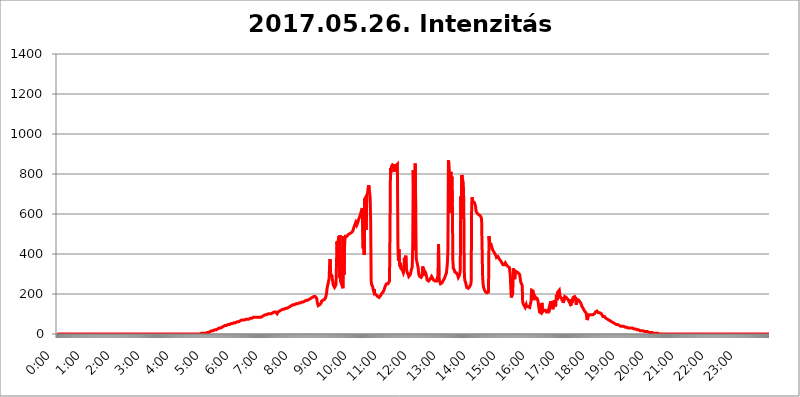
| Category | 2017.05.26. Intenzitás [W/m^2] |
|---|---|
| 0.0 | 0 |
| 0.0006944444444444445 | 0 |
| 0.001388888888888889 | 0 |
| 0.0020833333333333333 | 0 |
| 0.002777777777777778 | 0 |
| 0.003472222222222222 | 0 |
| 0.004166666666666667 | 0 |
| 0.004861111111111111 | 0 |
| 0.005555555555555556 | 0 |
| 0.0062499999999999995 | 0 |
| 0.006944444444444444 | 0 |
| 0.007638888888888889 | 0 |
| 0.008333333333333333 | 0 |
| 0.009027777777777779 | 0 |
| 0.009722222222222222 | 0 |
| 0.010416666666666666 | 0 |
| 0.011111111111111112 | 0 |
| 0.011805555555555555 | 0 |
| 0.012499999999999999 | 0 |
| 0.013194444444444444 | 0 |
| 0.013888888888888888 | 0 |
| 0.014583333333333332 | 0 |
| 0.015277777777777777 | 0 |
| 0.015972222222222224 | 0 |
| 0.016666666666666666 | 0 |
| 0.017361111111111112 | 0 |
| 0.018055555555555557 | 0 |
| 0.01875 | 0 |
| 0.019444444444444445 | 0 |
| 0.02013888888888889 | 0 |
| 0.020833333333333332 | 0 |
| 0.02152777777777778 | 0 |
| 0.022222222222222223 | 0 |
| 0.02291666666666667 | 0 |
| 0.02361111111111111 | 0 |
| 0.024305555555555556 | 0 |
| 0.024999999999999998 | 0 |
| 0.025694444444444447 | 0 |
| 0.02638888888888889 | 0 |
| 0.027083333333333334 | 0 |
| 0.027777777777777776 | 0 |
| 0.02847222222222222 | 0 |
| 0.029166666666666664 | 0 |
| 0.029861111111111113 | 0 |
| 0.030555555555555555 | 0 |
| 0.03125 | 0 |
| 0.03194444444444445 | 0 |
| 0.03263888888888889 | 0 |
| 0.03333333333333333 | 0 |
| 0.034027777777777775 | 0 |
| 0.034722222222222224 | 0 |
| 0.035416666666666666 | 0 |
| 0.036111111111111115 | 0 |
| 0.03680555555555556 | 0 |
| 0.0375 | 0 |
| 0.03819444444444444 | 0 |
| 0.03888888888888889 | 0 |
| 0.03958333333333333 | 0 |
| 0.04027777777777778 | 0 |
| 0.04097222222222222 | 0 |
| 0.041666666666666664 | 0 |
| 0.042361111111111106 | 0 |
| 0.04305555555555556 | 0 |
| 0.043750000000000004 | 0 |
| 0.044444444444444446 | 0 |
| 0.04513888888888889 | 0 |
| 0.04583333333333334 | 0 |
| 0.04652777777777778 | 0 |
| 0.04722222222222222 | 0 |
| 0.04791666666666666 | 0 |
| 0.04861111111111111 | 0 |
| 0.049305555555555554 | 0 |
| 0.049999999999999996 | 0 |
| 0.05069444444444445 | 0 |
| 0.051388888888888894 | 0 |
| 0.052083333333333336 | 0 |
| 0.05277777777777778 | 0 |
| 0.05347222222222222 | 0 |
| 0.05416666666666667 | 0 |
| 0.05486111111111111 | 0 |
| 0.05555555555555555 | 0 |
| 0.05625 | 0 |
| 0.05694444444444444 | 0 |
| 0.057638888888888885 | 0 |
| 0.05833333333333333 | 0 |
| 0.05902777777777778 | 0 |
| 0.059722222222222225 | 0 |
| 0.06041666666666667 | 0 |
| 0.061111111111111116 | 0 |
| 0.06180555555555556 | 0 |
| 0.0625 | 0 |
| 0.06319444444444444 | 0 |
| 0.06388888888888888 | 0 |
| 0.06458333333333334 | 0 |
| 0.06527777777777778 | 0 |
| 0.06597222222222222 | 0 |
| 0.06666666666666667 | 0 |
| 0.06736111111111111 | 0 |
| 0.06805555555555555 | 0 |
| 0.06874999999999999 | 0 |
| 0.06944444444444443 | 0 |
| 0.07013888888888889 | 0 |
| 0.07083333333333333 | 0 |
| 0.07152777777777779 | 0 |
| 0.07222222222222223 | 0 |
| 0.07291666666666667 | 0 |
| 0.07361111111111111 | 0 |
| 0.07430555555555556 | 0 |
| 0.075 | 0 |
| 0.07569444444444444 | 0 |
| 0.0763888888888889 | 0 |
| 0.07708333333333334 | 0 |
| 0.07777777777777778 | 0 |
| 0.07847222222222222 | 0 |
| 0.07916666666666666 | 0 |
| 0.0798611111111111 | 0 |
| 0.08055555555555556 | 0 |
| 0.08125 | 0 |
| 0.08194444444444444 | 0 |
| 0.08263888888888889 | 0 |
| 0.08333333333333333 | 0 |
| 0.08402777777777777 | 0 |
| 0.08472222222222221 | 0 |
| 0.08541666666666665 | 0 |
| 0.08611111111111112 | 0 |
| 0.08680555555555557 | 0 |
| 0.08750000000000001 | 0 |
| 0.08819444444444445 | 0 |
| 0.08888888888888889 | 0 |
| 0.08958333333333333 | 0 |
| 0.09027777777777778 | 0 |
| 0.09097222222222222 | 0 |
| 0.09166666666666667 | 0 |
| 0.09236111111111112 | 0 |
| 0.09305555555555556 | 0 |
| 0.09375 | 0 |
| 0.09444444444444444 | 0 |
| 0.09513888888888888 | 0 |
| 0.09583333333333333 | 0 |
| 0.09652777777777777 | 0 |
| 0.09722222222222222 | 0 |
| 0.09791666666666667 | 0 |
| 0.09861111111111111 | 0 |
| 0.09930555555555555 | 0 |
| 0.09999999999999999 | 0 |
| 0.10069444444444443 | 0 |
| 0.1013888888888889 | 0 |
| 0.10208333333333335 | 0 |
| 0.10277777777777779 | 0 |
| 0.10347222222222223 | 0 |
| 0.10416666666666667 | 0 |
| 0.10486111111111111 | 0 |
| 0.10555555555555556 | 0 |
| 0.10625 | 0 |
| 0.10694444444444444 | 0 |
| 0.1076388888888889 | 0 |
| 0.10833333333333334 | 0 |
| 0.10902777777777778 | 0 |
| 0.10972222222222222 | 0 |
| 0.1111111111111111 | 0 |
| 0.11180555555555556 | 0 |
| 0.11180555555555556 | 0 |
| 0.1125 | 0 |
| 0.11319444444444444 | 0 |
| 0.11388888888888889 | 0 |
| 0.11458333333333333 | 0 |
| 0.11527777777777777 | 0 |
| 0.11597222222222221 | 0 |
| 0.11666666666666665 | 0 |
| 0.1173611111111111 | 0 |
| 0.11805555555555557 | 0 |
| 0.11944444444444445 | 0 |
| 0.12013888888888889 | 0 |
| 0.12083333333333333 | 0 |
| 0.12152777777777778 | 0 |
| 0.12222222222222223 | 0 |
| 0.12291666666666667 | 0 |
| 0.12291666666666667 | 0 |
| 0.12361111111111112 | 0 |
| 0.12430555555555556 | 0 |
| 0.125 | 0 |
| 0.12569444444444444 | 0 |
| 0.12638888888888888 | 0 |
| 0.12708333333333333 | 0 |
| 0.16875 | 0 |
| 0.12847222222222224 | 0 |
| 0.12916666666666668 | 0 |
| 0.12986111111111112 | 0 |
| 0.13055555555555556 | 0 |
| 0.13125 | 0 |
| 0.13194444444444445 | 0 |
| 0.1326388888888889 | 0 |
| 0.13333333333333333 | 0 |
| 0.13402777777777777 | 0 |
| 0.13402777777777777 | 0 |
| 0.13472222222222222 | 0 |
| 0.13541666666666666 | 0 |
| 0.1361111111111111 | 0 |
| 0.13749999999999998 | 0 |
| 0.13819444444444443 | 0 |
| 0.1388888888888889 | 0 |
| 0.13958333333333334 | 0 |
| 0.14027777777777778 | 0 |
| 0.14097222222222222 | 0 |
| 0.14166666666666666 | 0 |
| 0.1423611111111111 | 0 |
| 0.14305555555555557 | 0 |
| 0.14375000000000002 | 0 |
| 0.14444444444444446 | 0 |
| 0.1451388888888889 | 0 |
| 0.1451388888888889 | 0 |
| 0.14652777777777778 | 0 |
| 0.14722222222222223 | 0 |
| 0.14791666666666667 | 0 |
| 0.1486111111111111 | 0 |
| 0.14930555555555555 | 0 |
| 0.15 | 0 |
| 0.15069444444444444 | 0 |
| 0.15138888888888888 | 0 |
| 0.15208333333333332 | 0 |
| 0.15277777777777776 | 0 |
| 0.15347222222222223 | 0 |
| 0.15416666666666667 | 0 |
| 0.15486111111111112 | 0 |
| 0.15555555555555556 | 0 |
| 0.15625 | 0 |
| 0.15694444444444444 | 0 |
| 0.15763888888888888 | 0 |
| 0.15833333333333333 | 0 |
| 0.15902777777777777 | 0 |
| 0.15972222222222224 | 0 |
| 0.16041666666666668 | 0 |
| 0.16111111111111112 | 0 |
| 0.16180555555555556 | 0 |
| 0.1625 | 0 |
| 0.16319444444444445 | 0 |
| 0.1638888888888889 | 0 |
| 0.16458333333333333 | 0 |
| 0.16527777777777777 | 0 |
| 0.16597222222222222 | 0 |
| 0.16666666666666666 | 0 |
| 0.1673611111111111 | 0 |
| 0.16805555555555554 | 0 |
| 0.16874999999999998 | 0 |
| 0.16944444444444443 | 0 |
| 0.17013888888888887 | 0 |
| 0.1708333333333333 | 0 |
| 0.17152777777777775 | 0 |
| 0.17222222222222225 | 0 |
| 0.1729166666666667 | 0 |
| 0.17361111111111113 | 0 |
| 0.17430555555555557 | 0 |
| 0.17500000000000002 | 0 |
| 0.17569444444444446 | 0 |
| 0.1763888888888889 | 0 |
| 0.17708333333333334 | 0 |
| 0.17777777777777778 | 0 |
| 0.17847222222222223 | 0 |
| 0.17916666666666667 | 0 |
| 0.1798611111111111 | 0 |
| 0.18055555555555555 | 0 |
| 0.18125 | 0 |
| 0.18194444444444444 | 0 |
| 0.1826388888888889 | 0 |
| 0.18333333333333335 | 0 |
| 0.1840277777777778 | 0 |
| 0.18472222222222223 | 0 |
| 0.18541666666666667 | 0 |
| 0.18611111111111112 | 0 |
| 0.18680555555555556 | 0 |
| 0.1875 | 0 |
| 0.18819444444444444 | 0 |
| 0.18888888888888888 | 0 |
| 0.18958333333333333 | 0 |
| 0.19027777777777777 | 0 |
| 0.1909722222222222 | 0 |
| 0.19166666666666665 | 0 |
| 0.19236111111111112 | 0 |
| 0.19305555555555554 | 0 |
| 0.19375 | 0 |
| 0.19444444444444445 | 0 |
| 0.1951388888888889 | 0 |
| 0.19583333333333333 | 0 |
| 0.19652777777777777 | 0 |
| 0.19722222222222222 | 0 |
| 0.19791666666666666 | 0 |
| 0.1986111111111111 | 0 |
| 0.19930555555555554 | 0 |
| 0.19999999999999998 | 0 |
| 0.20069444444444443 | 0 |
| 0.20138888888888887 | 3.525 |
| 0.2020833333333333 | 3.525 |
| 0.2027777777777778 | 3.525 |
| 0.2034722222222222 | 3.525 |
| 0.2041666666666667 | 3.525 |
| 0.20486111111111113 | 3.525 |
| 0.20555555555555557 | 3.525 |
| 0.20625000000000002 | 3.525 |
| 0.20694444444444446 | 3.525 |
| 0.2076388888888889 | 3.525 |
| 0.20833333333333334 | 3.525 |
| 0.20902777777777778 | 3.525 |
| 0.20972222222222223 | 3.525 |
| 0.21041666666666667 | 7.887 |
| 0.2111111111111111 | 7.887 |
| 0.21180555555555555 | 7.887 |
| 0.2125 | 7.887 |
| 0.21319444444444444 | 7.887 |
| 0.2138888888888889 | 12.257 |
| 0.21458333333333335 | 12.257 |
| 0.2152777777777778 | 12.257 |
| 0.21597222222222223 | 12.257 |
| 0.21666666666666667 | 16.636 |
| 0.21736111111111112 | 16.636 |
| 0.21805555555555556 | 16.636 |
| 0.21875 | 16.636 |
| 0.21944444444444444 | 16.636 |
| 0.22013888888888888 | 21.024 |
| 0.22083333333333333 | 21.024 |
| 0.22152777777777777 | 21.024 |
| 0.2222222222222222 | 21.024 |
| 0.22291666666666665 | 21.024 |
| 0.2236111111111111 | 25.419 |
| 0.22430555555555556 | 25.419 |
| 0.225 | 25.419 |
| 0.22569444444444445 | 25.419 |
| 0.2263888888888889 | 29.823 |
| 0.22708333333333333 | 29.823 |
| 0.22777777777777777 | 29.823 |
| 0.22847222222222222 | 29.823 |
| 0.22916666666666666 | 29.823 |
| 0.2298611111111111 | 29.823 |
| 0.23055555555555554 | 34.234 |
| 0.23124999999999998 | 34.234 |
| 0.23194444444444443 | 34.234 |
| 0.23263888888888887 | 38.653 |
| 0.2333333333333333 | 38.653 |
| 0.2340277777777778 | 38.653 |
| 0.2347222222222222 | 38.653 |
| 0.2354166666666667 | 43.079 |
| 0.23611111111111113 | 43.079 |
| 0.23680555555555557 | 43.079 |
| 0.23750000000000002 | 43.079 |
| 0.23819444444444446 | 47.511 |
| 0.2388888888888889 | 47.511 |
| 0.23958333333333334 | 47.511 |
| 0.24027777777777778 | 47.511 |
| 0.24097222222222223 | 47.511 |
| 0.24166666666666667 | 47.511 |
| 0.2423611111111111 | 47.511 |
| 0.24305555555555555 | 47.511 |
| 0.24375 | 51.951 |
| 0.24444444444444446 | 51.951 |
| 0.24513888888888888 | 51.951 |
| 0.24583333333333335 | 51.951 |
| 0.2465277777777778 | 51.951 |
| 0.24722222222222223 | 56.398 |
| 0.24791666666666667 | 56.398 |
| 0.24861111111111112 | 56.398 |
| 0.24930555555555556 | 56.398 |
| 0.25 | 56.398 |
| 0.25069444444444444 | 56.398 |
| 0.2513888888888889 | 60.85 |
| 0.2520833333333333 | 60.85 |
| 0.25277777777777777 | 60.85 |
| 0.2534722222222222 | 60.85 |
| 0.25416666666666665 | 60.85 |
| 0.2548611111111111 | 65.31 |
| 0.2555555555555556 | 65.31 |
| 0.25625000000000003 | 65.31 |
| 0.2569444444444445 | 65.31 |
| 0.2576388888888889 | 65.31 |
| 0.25833333333333336 | 69.775 |
| 0.2590277777777778 | 69.775 |
| 0.25972222222222224 | 69.775 |
| 0.2604166666666667 | 69.775 |
| 0.2611111111111111 | 69.775 |
| 0.26180555555555557 | 69.775 |
| 0.2625 | 69.775 |
| 0.26319444444444445 | 74.246 |
| 0.2638888888888889 | 74.246 |
| 0.26458333333333334 | 74.246 |
| 0.2652777777777778 | 74.246 |
| 0.2659722222222222 | 74.246 |
| 0.26666666666666666 | 74.246 |
| 0.2673611111111111 | 74.246 |
| 0.26805555555555555 | 74.246 |
| 0.26875 | 74.246 |
| 0.26944444444444443 | 74.246 |
| 0.2701388888888889 | 78.722 |
| 0.2708333333333333 | 78.722 |
| 0.27152777777777776 | 78.722 |
| 0.2722222222222222 | 78.722 |
| 0.27291666666666664 | 78.722 |
| 0.2736111111111111 | 78.722 |
| 0.2743055555555555 | 78.722 |
| 0.27499999999999997 | 83.205 |
| 0.27569444444444446 | 83.205 |
| 0.27638888888888885 | 83.205 |
| 0.27708333333333335 | 83.205 |
| 0.2777777777777778 | 83.205 |
| 0.27847222222222223 | 83.205 |
| 0.2791666666666667 | 83.205 |
| 0.2798611111111111 | 83.205 |
| 0.28055555555555556 | 83.205 |
| 0.28125 | 83.205 |
| 0.28194444444444444 | 83.205 |
| 0.2826388888888889 | 83.205 |
| 0.2833333333333333 | 83.205 |
| 0.28402777777777777 | 83.205 |
| 0.2847222222222222 | 83.205 |
| 0.28541666666666665 | 83.205 |
| 0.28611111111111115 | 87.692 |
| 0.28680555555555554 | 87.692 |
| 0.28750000000000003 | 87.692 |
| 0.2881944444444445 | 92.184 |
| 0.2888888888888889 | 92.184 |
| 0.28958333333333336 | 92.184 |
| 0.2902777777777778 | 92.184 |
| 0.29097222222222224 | 96.682 |
| 0.2916666666666667 | 96.682 |
| 0.2923611111111111 | 96.682 |
| 0.29305555555555557 | 96.682 |
| 0.29375 | 96.682 |
| 0.29444444444444445 | 96.682 |
| 0.2951388888888889 | 101.184 |
| 0.29583333333333334 | 101.184 |
| 0.2965277777777778 | 101.184 |
| 0.2972222222222222 | 101.184 |
| 0.29791666666666666 | 101.184 |
| 0.2986111111111111 | 101.184 |
| 0.29930555555555555 | 101.184 |
| 0.3 | 101.184 |
| 0.30069444444444443 | 105.69 |
| 0.3013888888888889 | 105.69 |
| 0.3020833333333333 | 105.69 |
| 0.30277777777777776 | 110.201 |
| 0.3034722222222222 | 110.201 |
| 0.30416666666666664 | 110.201 |
| 0.3048611111111111 | 110.201 |
| 0.3055555555555555 | 110.201 |
| 0.30624999999999997 | 110.201 |
| 0.3069444444444444 | 110.201 |
| 0.3076388888888889 | 105.69 |
| 0.30833333333333335 | 101.184 |
| 0.3090277777777778 | 105.69 |
| 0.30972222222222223 | 110.201 |
| 0.3104166666666667 | 105.69 |
| 0.3111111111111111 | 110.201 |
| 0.31180555555555556 | 114.716 |
| 0.3125 | 114.716 |
| 0.31319444444444444 | 119.235 |
| 0.3138888888888889 | 119.235 |
| 0.3145833333333333 | 119.235 |
| 0.31527777777777777 | 119.235 |
| 0.3159722222222222 | 123.758 |
| 0.31666666666666665 | 123.758 |
| 0.31736111111111115 | 123.758 |
| 0.31805555555555554 | 123.758 |
| 0.31875000000000003 | 123.758 |
| 0.3194444444444445 | 128.284 |
| 0.3201388888888889 | 128.284 |
| 0.32083333333333336 | 128.284 |
| 0.3215277777777778 | 128.284 |
| 0.32222222222222224 | 128.284 |
| 0.3229166666666667 | 132.814 |
| 0.3236111111111111 | 132.814 |
| 0.32430555555555557 | 132.814 |
| 0.325 | 137.347 |
| 0.32569444444444445 | 137.347 |
| 0.3263888888888889 | 137.347 |
| 0.32708333333333334 | 137.347 |
| 0.3277777777777778 | 137.347 |
| 0.3284722222222222 | 141.884 |
| 0.32916666666666666 | 141.884 |
| 0.3298611111111111 | 141.884 |
| 0.33055555555555555 | 146.423 |
| 0.33125 | 146.423 |
| 0.33194444444444443 | 146.423 |
| 0.3326388888888889 | 146.423 |
| 0.3333333333333333 | 146.423 |
| 0.3340277777777778 | 146.423 |
| 0.3347222222222222 | 150.964 |
| 0.3354166666666667 | 150.964 |
| 0.3361111111111111 | 150.964 |
| 0.3368055555555556 | 150.964 |
| 0.33749999999999997 | 155.509 |
| 0.33819444444444446 | 155.509 |
| 0.33888888888888885 | 155.509 |
| 0.33958333333333335 | 155.509 |
| 0.34027777777777773 | 155.509 |
| 0.34097222222222223 | 155.509 |
| 0.3416666666666666 | 160.056 |
| 0.3423611111111111 | 160.056 |
| 0.3430555555555555 | 160.056 |
| 0.34375 | 160.056 |
| 0.3444444444444445 | 160.056 |
| 0.3451388888888889 | 160.056 |
| 0.3458333333333334 | 164.605 |
| 0.34652777777777777 | 164.605 |
| 0.34722222222222227 | 164.605 |
| 0.34791666666666665 | 164.605 |
| 0.34861111111111115 | 164.605 |
| 0.34930555555555554 | 169.156 |
| 0.35000000000000003 | 169.156 |
| 0.3506944444444444 | 169.156 |
| 0.3513888888888889 | 169.156 |
| 0.3520833333333333 | 173.709 |
| 0.3527777777777778 | 173.709 |
| 0.3534722222222222 | 173.709 |
| 0.3541666666666667 | 173.709 |
| 0.3548611111111111 | 178.264 |
| 0.35555555555555557 | 178.264 |
| 0.35625 | 178.264 |
| 0.35694444444444445 | 178.264 |
| 0.3576388888888889 | 182.82 |
| 0.35833333333333334 | 182.82 |
| 0.3590277777777778 | 182.82 |
| 0.3597222222222222 | 187.378 |
| 0.36041666666666666 | 187.378 |
| 0.3611111111111111 | 187.378 |
| 0.36180555555555555 | 187.378 |
| 0.3625 | 191.937 |
| 0.36319444444444443 | 187.378 |
| 0.3638888888888889 | 178.264 |
| 0.3645833333333333 | 160.056 |
| 0.3652777777777778 | 150.964 |
| 0.3659722222222222 | 141.884 |
| 0.3666666666666667 | 146.423 |
| 0.3673611111111111 | 146.423 |
| 0.3680555555555556 | 146.423 |
| 0.36874999999999997 | 146.423 |
| 0.36944444444444446 | 150.964 |
| 0.37013888888888885 | 155.509 |
| 0.37083333333333335 | 164.605 |
| 0.37152777777777773 | 164.605 |
| 0.37222222222222223 | 169.156 |
| 0.3729166666666666 | 169.156 |
| 0.3736111111111111 | 169.156 |
| 0.3743055555555555 | 173.709 |
| 0.375 | 173.709 |
| 0.3756944444444445 | 178.264 |
| 0.3763888888888889 | 182.82 |
| 0.3770833333333334 | 191.937 |
| 0.37777777777777777 | 205.62 |
| 0.37847222222222227 | 228.436 |
| 0.37916666666666665 | 242.127 |
| 0.37986111111111115 | 251.251 |
| 0.38055555555555554 | 264.932 |
| 0.38125000000000003 | 274.047 |
| 0.3819444444444444 | 337.639 |
| 0.3826388888888889 | 373.729 |
| 0.3833333333333333 | 310.44 |
| 0.3840277777777778 | 287.709 |
| 0.3847222222222222 | 296.808 |
| 0.3854166666666667 | 283.156 |
| 0.3861111111111111 | 287.709 |
| 0.38680555555555557 | 251.251 |
| 0.3875 | 242.127 |
| 0.38819444444444445 | 237.564 |
| 0.3888888888888889 | 233 |
| 0.38958333333333334 | 233 |
| 0.3902777777777778 | 233 |
| 0.3909722222222222 | 246.689 |
| 0.39166666666666666 | 242.127 |
| 0.3923611111111111 | 462.786 |
| 0.39305555555555555 | 405.108 |
| 0.39375 | 462.786 |
| 0.39444444444444443 | 475.972 |
| 0.3951388888888889 | 489.108 |
| 0.3958333333333333 | 283.156 |
| 0.3965277777777778 | 493.475 |
| 0.3972222222222222 | 264.932 |
| 0.3979166666666667 | 264.932 |
| 0.3986111111111111 | 251.251 |
| 0.3993055555555556 | 255.813 |
| 0.39999999999999997 | 251.251 |
| 0.40069444444444446 | 228.436 |
| 0.40138888888888885 | 489.108 |
| 0.40208333333333335 | 296.808 |
| 0.40277777777777773 | 422.943 |
| 0.40347222222222223 | 471.582 |
| 0.4041666666666666 | 489.108 |
| 0.4048611111111111 | 484.735 |
| 0.4055555555555555 | 489.108 |
| 0.40625 | 489.108 |
| 0.4069444444444445 | 493.475 |
| 0.4076388888888889 | 493.475 |
| 0.4083333333333334 | 497.836 |
| 0.40902777777777777 | 497.836 |
| 0.40972222222222227 | 502.192 |
| 0.41041666666666665 | 502.192 |
| 0.41111111111111115 | 502.192 |
| 0.41180555555555554 | 506.542 |
| 0.41250000000000003 | 506.542 |
| 0.4131944444444444 | 506.542 |
| 0.4138888888888889 | 510.885 |
| 0.4145833333333333 | 515.223 |
| 0.4152777777777778 | 523.88 |
| 0.4159722222222222 | 532.513 |
| 0.4166666666666667 | 536.82 |
| 0.4173611111111111 | 545.416 |
| 0.41805555555555557 | 549.704 |
| 0.41875 | 558.261 |
| 0.41944444444444445 | 562.53 |
| 0.4201388888888889 | 545.416 |
| 0.42083333333333334 | 549.704 |
| 0.4215277777777778 | 558.261 |
| 0.4222222222222222 | 562.53 |
| 0.42291666666666666 | 575.299 |
| 0.4236111111111111 | 579.542 |
| 0.42430555555555555 | 588.009 |
| 0.425 | 592.233 |
| 0.42569444444444443 | 604.864 |
| 0.4263888888888889 | 609.062 |
| 0.4270833333333333 | 621.613 |
| 0.4277777777777778 | 629.948 |
| 0.4284722222222222 | 629.948 |
| 0.4291666666666667 | 427.39 |
| 0.4298611111111111 | 553.986 |
| 0.4305555555555556 | 396.164 |
| 0.43124999999999997 | 675.311 |
| 0.43194444444444446 | 679.395 |
| 0.43263888888888885 | 683.473 |
| 0.43333333333333335 | 519.555 |
| 0.43402777777777773 | 691.608 |
| 0.43472222222222223 | 699.717 |
| 0.4354166666666666 | 707.8 |
| 0.4361111111111111 | 731.896 |
| 0.4368055555555555 | 743.859 |
| 0.4375 | 727.896 |
| 0.4381944444444445 | 723.889 |
| 0.4388888888888889 | 679.395 |
| 0.4395833333333334 | 566.793 |
| 0.44027777777777777 | 264.932 |
| 0.44097222222222227 | 246.689 |
| 0.44166666666666665 | 242.127 |
| 0.44236111111111115 | 237.564 |
| 0.44305555555555554 | 223.873 |
| 0.44375000000000003 | 214.746 |
| 0.4444444444444444 | 223.873 |
| 0.4451388888888889 | 201.058 |
| 0.4458333333333333 | 201.058 |
| 0.4465277777777778 | 201.058 |
| 0.4472222222222222 | 196.497 |
| 0.4479166666666667 | 191.937 |
| 0.4486111111111111 | 191.937 |
| 0.44930555555555557 | 187.378 |
| 0.45 | 182.82 |
| 0.45069444444444445 | 187.378 |
| 0.4513888888888889 | 182.82 |
| 0.45208333333333334 | 182.82 |
| 0.4527777777777778 | 187.378 |
| 0.4534722222222222 | 191.937 |
| 0.45416666666666666 | 196.497 |
| 0.4548611111111111 | 201.058 |
| 0.45555555555555555 | 201.058 |
| 0.45625 | 205.62 |
| 0.45694444444444443 | 210.182 |
| 0.4576388888888889 | 214.746 |
| 0.4583333333333333 | 219.309 |
| 0.4590277777777778 | 228.436 |
| 0.4597222222222222 | 233 |
| 0.4604166666666667 | 242.127 |
| 0.4611111111111111 | 246.689 |
| 0.4618055555555556 | 251.251 |
| 0.46249999999999997 | 255.813 |
| 0.46319444444444446 | 251.251 |
| 0.46388888888888885 | 251.251 |
| 0.46458333333333335 | 246.689 |
| 0.46527777777777773 | 251.251 |
| 0.46597222222222223 | 264.932 |
| 0.4666666666666666 | 506.542 |
| 0.4673611111111111 | 829.981 |
| 0.4680555555555555 | 806.757 |
| 0.46875 | 837.682 |
| 0.4694444444444445 | 837.682 |
| 0.4701388888888889 | 845.365 |
| 0.4708333333333334 | 845.365 |
| 0.47152777777777777 | 841.526 |
| 0.47222222222222227 | 837.682 |
| 0.47291666666666665 | 849.199 |
| 0.47361111111111115 | 810.641 |
| 0.47430555555555554 | 829.981 |
| 0.47500000000000003 | 841.526 |
| 0.4756944444444444 | 845.365 |
| 0.4763888888888889 | 841.526 |
| 0.4770833333333333 | 849.199 |
| 0.4777777777777778 | 445.129 |
| 0.4784722222222222 | 364.728 |
| 0.4791666666666667 | 422.943 |
| 0.4798611111111111 | 364.728 |
| 0.48055555555555557 | 337.639 |
| 0.48125 | 355.712 |
| 0.48194444444444445 | 328.584 |
| 0.4826388888888889 | 324.052 |
| 0.48333333333333334 | 324.052 |
| 0.4840277777777778 | 319.517 |
| 0.4847222222222222 | 314.98 |
| 0.48541666666666666 | 305.898 |
| 0.4861111111111111 | 314.98 |
| 0.48680555555555555 | 378.224 |
| 0.4875 | 346.682 |
| 0.48819444444444443 | 382.715 |
| 0.4888888888888889 | 391.685 |
| 0.4895833333333333 | 328.584 |
| 0.4902777777777778 | 314.98 |
| 0.4909722222222222 | 305.898 |
| 0.4916666666666667 | 301.354 |
| 0.4923611111111111 | 296.808 |
| 0.4930555555555556 | 287.709 |
| 0.49374999999999997 | 287.709 |
| 0.49444444444444446 | 287.709 |
| 0.49513888888888885 | 296.808 |
| 0.49583333333333335 | 301.354 |
| 0.49652777777777773 | 319.517 |
| 0.49722222222222223 | 328.584 |
| 0.4979166666666666 | 337.639 |
| 0.4986111111111111 | 458.38 |
| 0.4993055555555555 | 818.392 |
| 0.5 | 642.4 |
| 0.5006944444444444 | 418.492 |
| 0.5013888888888889 | 609.062 |
| 0.5020833333333333 | 853.029 |
| 0.5027777777777778 | 609.062 |
| 0.5034722222222222 | 378.224 |
| 0.5041666666666667 | 364.728 |
| 0.5048611111111111 | 360.221 |
| 0.5055555555555555 | 342.162 |
| 0.50625 | 328.584 |
| 0.5069444444444444 | 301.354 |
| 0.5076388888888889 | 296.808 |
| 0.5083333333333333 | 287.709 |
| 0.5090277777777777 | 287.709 |
| 0.5097222222222222 | 283.156 |
| 0.5104166666666666 | 283.156 |
| 0.5111111111111112 | 278.603 |
| 0.5118055555555555 | 292.259 |
| 0.5125000000000001 | 337.639 |
| 0.5131944444444444 | 324.052 |
| 0.513888888888889 | 292.259 |
| 0.5145833333333333 | 296.808 |
| 0.5152777777777778 | 314.98 |
| 0.5159722222222222 | 310.44 |
| 0.5166666666666667 | 305.898 |
| 0.517361111111111 | 301.354 |
| 0.5180555555555556 | 287.709 |
| 0.5187499999999999 | 269.49 |
| 0.5194444444444445 | 269.49 |
| 0.5201388888888888 | 264.932 |
| 0.5208333333333334 | 264.932 |
| 0.5215277777777778 | 264.932 |
| 0.5222222222222223 | 269.49 |
| 0.5229166666666667 | 274.047 |
| 0.5236111111111111 | 274.047 |
| 0.5243055555555556 | 278.603 |
| 0.525 | 287.709 |
| 0.5256944444444445 | 283.156 |
| 0.5263888888888889 | 278.603 |
| 0.5270833333333333 | 274.047 |
| 0.5277777777777778 | 269.49 |
| 0.5284722222222222 | 264.932 |
| 0.5291666666666667 | 264.932 |
| 0.5298611111111111 | 264.932 |
| 0.5305555555555556 | 260.373 |
| 0.53125 | 260.373 |
| 0.5319444444444444 | 264.932 |
| 0.5326388888888889 | 264.932 |
| 0.5333333333333333 | 269.49 |
| 0.5340277777777778 | 292.259 |
| 0.5347222222222222 | 449.551 |
| 0.5354166666666667 | 292.259 |
| 0.5361111111111111 | 264.932 |
| 0.5368055555555555 | 260.373 |
| 0.5375 | 251.251 |
| 0.5381944444444444 | 251.251 |
| 0.5388888888888889 | 251.251 |
| 0.5395833333333333 | 255.813 |
| 0.5402777777777777 | 260.373 |
| 0.5409722222222222 | 260.373 |
| 0.5416666666666666 | 269.49 |
| 0.5423611111111112 | 269.49 |
| 0.5430555555555555 | 278.603 |
| 0.5437500000000001 | 283.156 |
| 0.5444444444444444 | 292.259 |
| 0.545138888888889 | 296.808 |
| 0.5458333333333333 | 305.898 |
| 0.5465277777777778 | 328.584 |
| 0.5472222222222222 | 355.712 |
| 0.5479166666666667 | 418.492 |
| 0.548611111111111 | 868.305 |
| 0.5493055555555556 | 849.199 |
| 0.5499999999999999 | 806.757 |
| 0.5506944444444445 | 604.864 |
| 0.5513888888888888 | 791.169 |
| 0.5520833333333334 | 810.641 |
| 0.5527777777777778 | 767.62 |
| 0.5534722222222223 | 787.258 |
| 0.5541666666666667 | 650.667 |
| 0.5548611111111111 | 369.23 |
| 0.5555555555555556 | 328.584 |
| 0.55625 | 324.052 |
| 0.5569444444444445 | 319.517 |
| 0.5576388888888889 | 310.44 |
| 0.5583333333333333 | 305.898 |
| 0.5590277777777778 | 305.898 |
| 0.5597222222222222 | 305.898 |
| 0.5604166666666667 | 305.898 |
| 0.5611111111111111 | 301.354 |
| 0.5618055555555556 | 292.259 |
| 0.5625 | 283.156 |
| 0.5631944444444444 | 287.709 |
| 0.5638888888888889 | 292.259 |
| 0.5645833333333333 | 301.354 |
| 0.5652777777777778 | 324.052 |
| 0.5659722222222222 | 687.544 |
| 0.5666666666666667 | 575.299 |
| 0.5673611111111111 | 795.074 |
| 0.5680555555555555 | 783.342 |
| 0.56875 | 767.62 |
| 0.5694444444444444 | 755.766 |
| 0.5701388888888889 | 667.123 |
| 0.5708333333333333 | 314.98 |
| 0.5715277777777777 | 269.49 |
| 0.5722222222222222 | 264.932 |
| 0.5729166666666666 | 255.813 |
| 0.5736111111111112 | 242.127 |
| 0.5743055555555555 | 233 |
| 0.5750000000000001 | 233 |
| 0.5756944444444444 | 233 |
| 0.576388888888889 | 228.436 |
| 0.5770833333333333 | 228.436 |
| 0.5777777777777778 | 228.436 |
| 0.5784722222222222 | 237.564 |
| 0.5791666666666667 | 242.127 |
| 0.579861111111111 | 246.689 |
| 0.5805555555555556 | 264.932 |
| 0.5812499999999999 | 650.667 |
| 0.5819444444444445 | 683.473 |
| 0.5826388888888888 | 663.019 |
| 0.5833333333333334 | 658.909 |
| 0.5840277777777778 | 658.909 |
| 0.5847222222222223 | 658.909 |
| 0.5854166666666667 | 654.791 |
| 0.5861111111111111 | 646.537 |
| 0.5868055555555556 | 634.105 |
| 0.5875 | 613.252 |
| 0.5881944444444445 | 609.062 |
| 0.5888888888888889 | 604.864 |
| 0.5895833333333333 | 604.864 |
| 0.5902777777777778 | 600.661 |
| 0.5909722222222222 | 596.45 |
| 0.5916666666666667 | 596.45 |
| 0.5923611111111111 | 592.233 |
| 0.5930555555555556 | 592.233 |
| 0.59375 | 588.009 |
| 0.5944444444444444 | 583.779 |
| 0.5951388888888889 | 575.299 |
| 0.5958333333333333 | 571.049 |
| 0.5965277777777778 | 296.808 |
| 0.5972222222222222 | 251.251 |
| 0.5979166666666667 | 233 |
| 0.5986111111111111 | 228.436 |
| 0.5993055555555555 | 219.309 |
| 0.6 | 214.746 |
| 0.6006944444444444 | 210.182 |
| 0.6013888888888889 | 205.62 |
| 0.6020833333333333 | 205.62 |
| 0.6027777777777777 | 205.62 |
| 0.6034722222222222 | 205.62 |
| 0.6041666666666666 | 201.058 |
| 0.6048611111111112 | 210.182 |
| 0.6055555555555555 | 489.108 |
| 0.6062500000000001 | 458.38 |
| 0.6069444444444444 | 458.38 |
| 0.607638888888889 | 458.38 |
| 0.6083333333333333 | 449.551 |
| 0.6090277777777778 | 440.702 |
| 0.6097222222222222 | 431.833 |
| 0.6104166666666667 | 422.943 |
| 0.611111111111111 | 422.943 |
| 0.6118055555555556 | 414.035 |
| 0.6124999999999999 | 414.035 |
| 0.6131944444444445 | 405.108 |
| 0.6138888888888888 | 405.108 |
| 0.6145833333333334 | 400.638 |
| 0.6152777777777778 | 391.685 |
| 0.6159722222222223 | 382.715 |
| 0.6166666666666667 | 382.715 |
| 0.6173611111111111 | 387.202 |
| 0.6180555555555556 | 387.202 |
| 0.61875 | 387.202 |
| 0.6194444444444445 | 382.715 |
| 0.6201388888888889 | 373.729 |
| 0.6208333333333333 | 369.23 |
| 0.6215277777777778 | 369.23 |
| 0.6222222222222222 | 364.728 |
| 0.6229166666666667 | 360.221 |
| 0.6236111111111111 | 355.712 |
| 0.6243055555555556 | 351.198 |
| 0.625 | 346.682 |
| 0.6256944444444444 | 342.162 |
| 0.6263888888888889 | 346.682 |
| 0.6270833333333333 | 346.682 |
| 0.6277777777777778 | 346.682 |
| 0.6284722222222222 | 355.712 |
| 0.6291666666666667 | 351.198 |
| 0.6298611111111111 | 346.682 |
| 0.6305555555555555 | 346.682 |
| 0.63125 | 342.162 |
| 0.6319444444444444 | 337.639 |
| 0.6326388888888889 | 333.113 |
| 0.6333333333333333 | 333.113 |
| 0.6340277777777777 | 333.113 |
| 0.6347222222222222 | 333.113 |
| 0.6354166666666666 | 292.259 |
| 0.6361111111111112 | 233 |
| 0.6368055555555555 | 182.82 |
| 0.6375000000000001 | 182.82 |
| 0.6381944444444444 | 187.378 |
| 0.638888888888889 | 205.62 |
| 0.6395833333333333 | 328.584 |
| 0.6402777777777778 | 319.517 |
| 0.6409722222222222 | 324.052 |
| 0.6416666666666667 | 274.047 |
| 0.642361111111111 | 314.98 |
| 0.6430555555555556 | 314.98 |
| 0.6437499999999999 | 314.98 |
| 0.6444444444444445 | 310.44 |
| 0.6451388888888888 | 314.98 |
| 0.6458333333333334 | 314.98 |
| 0.6465277777777778 | 305.898 |
| 0.6472222222222223 | 305.898 |
| 0.6479166666666667 | 301.354 |
| 0.6486111111111111 | 296.808 |
| 0.6493055555555556 | 292.259 |
| 0.65 | 260.373 |
| 0.6506944444444445 | 264.932 |
| 0.6513888888888889 | 264.932 |
| 0.6520833333333333 | 242.127 |
| 0.6527777777777778 | 160.056 |
| 0.6534722222222222 | 150.964 |
| 0.6541666666666667 | 146.423 |
| 0.6548611111111111 | 141.884 |
| 0.6555555555555556 | 137.347 |
| 0.65625 | 132.814 |
| 0.6569444444444444 | 132.814 |
| 0.6576388888888889 | 146.423 |
| 0.6583333333333333 | 137.347 |
| 0.6590277777777778 | 137.347 |
| 0.6597222222222222 | 132.814 |
| 0.6604166666666667 | 137.347 |
| 0.6611111111111111 | 132.814 |
| 0.6618055555555555 | 132.814 |
| 0.6625 | 132.814 |
| 0.6631944444444444 | 132.814 |
| 0.6638888888888889 | 137.347 |
| 0.6645833333333333 | 164.605 |
| 0.6652777777777777 | 219.309 |
| 0.6659722222222222 | 219.309 |
| 0.6666666666666666 | 219.309 |
| 0.6673611111111111 | 214.746 |
| 0.6680555555555556 | 201.058 |
| 0.6687500000000001 | 169.156 |
| 0.6694444444444444 | 191.937 |
| 0.6701388888888888 | 191.937 |
| 0.6708333333333334 | 182.82 |
| 0.6715277777777778 | 182.82 |
| 0.6722222222222222 | 182.82 |
| 0.6729166666666666 | 178.264 |
| 0.6736111111111112 | 173.709 |
| 0.6743055555555556 | 164.605 |
| 0.6749999999999999 | 164.605 |
| 0.6756944444444444 | 128.284 |
| 0.6763888888888889 | 110.201 |
| 0.6770833333333334 | 110.201 |
| 0.6777777777777777 | 105.69 |
| 0.6784722222222223 | 105.69 |
| 0.6791666666666667 | 105.69 |
| 0.6798611111111111 | 155.509 |
| 0.6805555555555555 | 110.201 |
| 0.68125 | 110.201 |
| 0.6819444444444445 | 114.716 |
| 0.6826388888888889 | 119.235 |
| 0.6833333333333332 | 119.235 |
| 0.6840277777777778 | 119.235 |
| 0.6847222222222222 | 119.235 |
| 0.6854166666666667 | 119.235 |
| 0.686111111111111 | 110.201 |
| 0.6868055555555556 | 110.201 |
| 0.6875 | 110.201 |
| 0.6881944444444444 | 110.201 |
| 0.688888888888889 | 110.201 |
| 0.6895833333333333 | 110.201 |
| 0.6902777777777778 | 137.347 |
| 0.6909722222222222 | 128.284 |
| 0.6916666666666668 | 137.347 |
| 0.6923611111111111 | 164.605 |
| 0.6930555555555555 | 169.156 |
| 0.69375 | 141.884 |
| 0.6944444444444445 | 146.423 |
| 0.6951388888888889 | 123.758 |
| 0.6958333333333333 | 119.235 |
| 0.6965277777777777 | 123.758 |
| 0.6972222222222223 | 169.156 |
| 0.6979166666666666 | 150.964 |
| 0.6986111111111111 | 137.347 |
| 0.6993055555555556 | 150.964 |
| 0.7000000000000001 | 196.497 |
| 0.7006944444444444 | 182.82 |
| 0.7013888888888888 | 169.156 |
| 0.7020833333333334 | 210.182 |
| 0.7027777777777778 | 214.746 |
| 0.7034722222222222 | 214.746 |
| 0.7041666666666666 | 219.309 |
| 0.7048611111111112 | 214.746 |
| 0.7055555555555556 | 182.82 |
| 0.7062499999999999 | 187.378 |
| 0.7069444444444444 | 182.82 |
| 0.7076388888888889 | 178.264 |
| 0.7083333333333334 | 164.605 |
| 0.7090277777777777 | 182.82 |
| 0.7097222222222223 | 155.509 |
| 0.7104166666666667 | 155.509 |
| 0.7111111111111111 | 150.964 |
| 0.7118055555555555 | 187.378 |
| 0.7125 | 182.82 |
| 0.7131944444444445 | 182.82 |
| 0.7138888888888889 | 182.82 |
| 0.7145833333333332 | 178.264 |
| 0.7152777777777778 | 178.264 |
| 0.7159722222222222 | 173.709 |
| 0.7166666666666667 | 169.156 |
| 0.717361111111111 | 164.605 |
| 0.7180555555555556 | 164.605 |
| 0.71875 | 155.509 |
| 0.7194444444444444 | 173.709 |
| 0.720138888888889 | 141.884 |
| 0.7208333333333333 | 146.423 |
| 0.7215277777777778 | 164.605 |
| 0.7222222222222222 | 155.509 |
| 0.7229166666666668 | 150.964 |
| 0.7236111111111111 | 182.82 |
| 0.7243055555555555 | 187.378 |
| 0.725 | 187.378 |
| 0.7256944444444445 | 187.378 |
| 0.7263888888888889 | 187.378 |
| 0.7270833333333333 | 178.264 |
| 0.7277777777777777 | 146.423 |
| 0.7284722222222223 | 155.509 |
| 0.7291666666666666 | 173.709 |
| 0.7298611111111111 | 173.709 |
| 0.7305555555555556 | 169.156 |
| 0.7312500000000001 | 169.156 |
| 0.7319444444444444 | 164.605 |
| 0.7326388888888888 | 164.605 |
| 0.7333333333333334 | 160.056 |
| 0.7340277777777778 | 155.509 |
| 0.7347222222222222 | 150.964 |
| 0.7354166666666666 | 141.884 |
| 0.7361111111111112 | 137.347 |
| 0.7368055555555556 | 132.814 |
| 0.7374999999999999 | 128.284 |
| 0.7381944444444444 | 123.758 |
| 0.7388888888888889 | 119.235 |
| 0.7395833333333334 | 114.716 |
| 0.7402777777777777 | 110.201 |
| 0.7409722222222223 | 110.201 |
| 0.7416666666666667 | 105.69 |
| 0.7423611111111111 | 92.184 |
| 0.7430555555555555 | 69.775 |
| 0.74375 | 74.246 |
| 0.7444444444444445 | 83.205 |
| 0.7451388888888889 | 96.682 |
| 0.7458333333333332 | 96.682 |
| 0.7465277777777778 | 96.682 |
| 0.7472222222222222 | 96.682 |
| 0.7479166666666667 | 96.682 |
| 0.748611111111111 | 96.682 |
| 0.7493055555555556 | 96.682 |
| 0.75 | 96.682 |
| 0.7506944444444444 | 96.682 |
| 0.751388888888889 | 96.682 |
| 0.7520833333333333 | 96.682 |
| 0.7527777777777778 | 101.184 |
| 0.7534722222222222 | 101.184 |
| 0.7541666666666668 | 105.69 |
| 0.7548611111111111 | 110.201 |
| 0.7555555555555555 | 114.716 |
| 0.75625 | 114.716 |
| 0.7569444444444445 | 114.716 |
| 0.7576388888888889 | 110.201 |
| 0.7583333333333333 | 110.201 |
| 0.7590277777777777 | 105.69 |
| 0.7597222222222223 | 105.69 |
| 0.7604166666666666 | 105.69 |
| 0.7611111111111111 | 105.69 |
| 0.7618055555555556 | 101.184 |
| 0.7625000000000001 | 101.184 |
| 0.7631944444444444 | 101.184 |
| 0.7638888888888888 | 96.682 |
| 0.7645833333333334 | 96.682 |
| 0.7652777777777778 | 87.692 |
| 0.7659722222222222 | 87.692 |
| 0.7666666666666666 | 87.692 |
| 0.7673611111111112 | 87.692 |
| 0.7680555555555556 | 83.205 |
| 0.7687499999999999 | 83.205 |
| 0.7694444444444444 | 78.722 |
| 0.7701388888888889 | 74.246 |
| 0.7708333333333334 | 74.246 |
| 0.7715277777777777 | 74.246 |
| 0.7722222222222223 | 69.775 |
| 0.7729166666666667 | 69.775 |
| 0.7736111111111111 | 69.775 |
| 0.7743055555555555 | 65.31 |
| 0.775 | 65.31 |
| 0.7756944444444445 | 65.31 |
| 0.7763888888888889 | 60.85 |
| 0.7770833333333332 | 60.85 |
| 0.7777777777777778 | 60.85 |
| 0.7784722222222222 | 56.398 |
| 0.7791666666666667 | 56.398 |
| 0.779861111111111 | 56.398 |
| 0.7805555555555556 | 56.398 |
| 0.78125 | 51.951 |
| 0.7819444444444444 | 51.951 |
| 0.782638888888889 | 51.951 |
| 0.7833333333333333 | 51.951 |
| 0.7840277777777778 | 47.511 |
| 0.7847222222222222 | 47.511 |
| 0.7854166666666668 | 47.511 |
| 0.7861111111111111 | 47.511 |
| 0.7868055555555555 | 43.079 |
| 0.7875 | 43.079 |
| 0.7881944444444445 | 43.079 |
| 0.7888888888888889 | 43.079 |
| 0.7895833333333333 | 43.079 |
| 0.7902777777777777 | 38.653 |
| 0.7909722222222223 | 38.653 |
| 0.7916666666666666 | 38.653 |
| 0.7923611111111111 | 38.653 |
| 0.7930555555555556 | 38.653 |
| 0.7937500000000001 | 38.653 |
| 0.7944444444444444 | 38.653 |
| 0.7951388888888888 | 38.653 |
| 0.7958333333333334 | 34.234 |
| 0.7965277777777778 | 34.234 |
| 0.7972222222222222 | 34.234 |
| 0.7979166666666666 | 34.234 |
| 0.7986111111111112 | 34.234 |
| 0.7993055555555556 | 34.234 |
| 0.7999999999999999 | 34.234 |
| 0.8006944444444444 | 29.823 |
| 0.8013888888888889 | 29.823 |
| 0.8020833333333334 | 29.823 |
| 0.8027777777777777 | 29.823 |
| 0.8034722222222223 | 29.823 |
| 0.8041666666666667 | 29.823 |
| 0.8048611111111111 | 29.823 |
| 0.8055555555555555 | 29.823 |
| 0.80625 | 29.823 |
| 0.8069444444444445 | 29.823 |
| 0.8076388888888889 | 25.419 |
| 0.8083333333333332 | 25.419 |
| 0.8090277777777778 | 25.419 |
| 0.8097222222222222 | 25.419 |
| 0.8104166666666667 | 25.419 |
| 0.811111111111111 | 25.419 |
| 0.8118055555555556 | 25.419 |
| 0.8125 | 25.419 |
| 0.8131944444444444 | 21.024 |
| 0.813888888888889 | 21.024 |
| 0.8145833333333333 | 21.024 |
| 0.8152777777777778 | 21.024 |
| 0.8159722222222222 | 21.024 |
| 0.8166666666666668 | 21.024 |
| 0.8173611111111111 | 16.636 |
| 0.8180555555555555 | 16.636 |
| 0.81875 | 16.636 |
| 0.8194444444444445 | 16.636 |
| 0.8201388888888889 | 16.636 |
| 0.8208333333333333 | 16.636 |
| 0.8215277777777777 | 16.636 |
| 0.8222222222222223 | 16.636 |
| 0.8229166666666666 | 12.257 |
| 0.8236111111111111 | 12.257 |
| 0.8243055555555556 | 12.257 |
| 0.8250000000000001 | 12.257 |
| 0.8256944444444444 | 12.257 |
| 0.8263888888888888 | 12.257 |
| 0.8270833333333334 | 12.257 |
| 0.8277777777777778 | 12.257 |
| 0.8284722222222222 | 12.257 |
| 0.8291666666666666 | 12.257 |
| 0.8298611111111112 | 7.887 |
| 0.8305555555555556 | 7.887 |
| 0.8312499999999999 | 7.887 |
| 0.8319444444444444 | 7.887 |
| 0.8326388888888889 | 7.887 |
| 0.8333333333333334 | 7.887 |
| 0.8340277777777777 | 7.887 |
| 0.8347222222222223 | 7.887 |
| 0.8354166666666667 | 7.887 |
| 0.8361111111111111 | 3.525 |
| 0.8368055555555555 | 3.525 |
| 0.8375 | 3.525 |
| 0.8381944444444445 | 3.525 |
| 0.8388888888888889 | 3.525 |
| 0.8395833333333332 | 3.525 |
| 0.8402777777777778 | 3.525 |
| 0.8409722222222222 | 3.525 |
| 0.8416666666666667 | 3.525 |
| 0.842361111111111 | 3.525 |
| 0.8430555555555556 | 3.525 |
| 0.84375 | 0 |
| 0.8444444444444444 | 0 |
| 0.845138888888889 | 0 |
| 0.8458333333333333 | 0 |
| 0.8465277777777778 | 0 |
| 0.8472222222222222 | 0 |
| 0.8479166666666668 | 0 |
| 0.8486111111111111 | 0 |
| 0.8493055555555555 | 0 |
| 0.85 | 0 |
| 0.8506944444444445 | 0 |
| 0.8513888888888889 | 0 |
| 0.8520833333333333 | 0 |
| 0.8527777777777777 | 0 |
| 0.8534722222222223 | 0 |
| 0.8541666666666666 | 0 |
| 0.8548611111111111 | 0 |
| 0.8555555555555556 | 0 |
| 0.8562500000000001 | 0 |
| 0.8569444444444444 | 0 |
| 0.8576388888888888 | 0 |
| 0.8583333333333334 | 0 |
| 0.8590277777777778 | 0 |
| 0.8597222222222222 | 0 |
| 0.8604166666666666 | 0 |
| 0.8611111111111112 | 0 |
| 0.8618055555555556 | 0 |
| 0.8624999999999999 | 0 |
| 0.8631944444444444 | 0 |
| 0.8638888888888889 | 0 |
| 0.8645833333333334 | 0 |
| 0.8652777777777777 | 0 |
| 0.8659722222222223 | 0 |
| 0.8666666666666667 | 0 |
| 0.8673611111111111 | 0 |
| 0.8680555555555555 | 0 |
| 0.86875 | 0 |
| 0.8694444444444445 | 0 |
| 0.8701388888888889 | 0 |
| 0.8708333333333332 | 0 |
| 0.8715277777777778 | 0 |
| 0.8722222222222222 | 0 |
| 0.8729166666666667 | 0 |
| 0.873611111111111 | 0 |
| 0.8743055555555556 | 0 |
| 0.875 | 0 |
| 0.8756944444444444 | 0 |
| 0.876388888888889 | 0 |
| 0.8770833333333333 | 0 |
| 0.8777777777777778 | 0 |
| 0.8784722222222222 | 0 |
| 0.8791666666666668 | 0 |
| 0.8798611111111111 | 0 |
| 0.8805555555555555 | 0 |
| 0.88125 | 0 |
| 0.8819444444444445 | 0 |
| 0.8826388888888889 | 0 |
| 0.8833333333333333 | 0 |
| 0.8840277777777777 | 0 |
| 0.8847222222222223 | 0 |
| 0.8854166666666666 | 0 |
| 0.8861111111111111 | 0 |
| 0.8868055555555556 | 0 |
| 0.8875000000000001 | 0 |
| 0.8881944444444444 | 0 |
| 0.8888888888888888 | 0 |
| 0.8895833333333334 | 0 |
| 0.8902777777777778 | 0 |
| 0.8909722222222222 | 0 |
| 0.8916666666666666 | 0 |
| 0.8923611111111112 | 0 |
| 0.8930555555555556 | 0 |
| 0.8937499999999999 | 0 |
| 0.8944444444444444 | 0 |
| 0.8951388888888889 | 0 |
| 0.8958333333333334 | 0 |
| 0.8965277777777777 | 0 |
| 0.8972222222222223 | 0 |
| 0.8979166666666667 | 0 |
| 0.8986111111111111 | 0 |
| 0.8993055555555555 | 0 |
| 0.9 | 0 |
| 0.9006944444444445 | 0 |
| 0.9013888888888889 | 0 |
| 0.9020833333333332 | 0 |
| 0.9027777777777778 | 0 |
| 0.9034722222222222 | 0 |
| 0.9041666666666667 | 0 |
| 0.904861111111111 | 0 |
| 0.9055555555555556 | 0 |
| 0.90625 | 0 |
| 0.9069444444444444 | 0 |
| 0.907638888888889 | 0 |
| 0.9083333333333333 | 0 |
| 0.9090277777777778 | 0 |
| 0.9097222222222222 | 0 |
| 0.9104166666666668 | 0 |
| 0.9111111111111111 | 0 |
| 0.9118055555555555 | 0 |
| 0.9125 | 0 |
| 0.9131944444444445 | 0 |
| 0.9138888888888889 | 0 |
| 0.9145833333333333 | 0 |
| 0.9152777777777777 | 0 |
| 0.9159722222222223 | 0 |
| 0.9166666666666666 | 0 |
| 0.9173611111111111 | 0 |
| 0.9180555555555556 | 0 |
| 0.9187500000000001 | 0 |
| 0.9194444444444444 | 0 |
| 0.9201388888888888 | 0 |
| 0.9208333333333334 | 0 |
| 0.9215277777777778 | 0 |
| 0.9222222222222222 | 0 |
| 0.9229166666666666 | 0 |
| 0.9236111111111112 | 0 |
| 0.9243055555555556 | 0 |
| 0.9249999999999999 | 0 |
| 0.9256944444444444 | 0 |
| 0.9263888888888889 | 0 |
| 0.9270833333333334 | 0 |
| 0.9277777777777777 | 0 |
| 0.9284722222222223 | 0 |
| 0.9291666666666667 | 0 |
| 0.9298611111111111 | 0 |
| 0.9305555555555555 | 0 |
| 0.93125 | 0 |
| 0.9319444444444445 | 0 |
| 0.9326388888888889 | 0 |
| 0.9333333333333332 | 0 |
| 0.9340277777777778 | 0 |
| 0.9347222222222222 | 0 |
| 0.9354166666666667 | 0 |
| 0.936111111111111 | 0 |
| 0.9368055555555556 | 0 |
| 0.9375 | 0 |
| 0.9381944444444444 | 0 |
| 0.938888888888889 | 0 |
| 0.9395833333333333 | 0 |
| 0.9402777777777778 | 0 |
| 0.9409722222222222 | 0 |
| 0.9416666666666668 | 0 |
| 0.9423611111111111 | 0 |
| 0.9430555555555555 | 0 |
| 0.94375 | 0 |
| 0.9444444444444445 | 0 |
| 0.9451388888888889 | 0 |
| 0.9458333333333333 | 0 |
| 0.9465277777777777 | 0 |
| 0.9472222222222223 | 0 |
| 0.9479166666666666 | 0 |
| 0.9486111111111111 | 0 |
| 0.9493055555555556 | 0 |
| 0.9500000000000001 | 0 |
| 0.9506944444444444 | 0 |
| 0.9513888888888888 | 0 |
| 0.9520833333333334 | 0 |
| 0.9527777777777778 | 0 |
| 0.9534722222222222 | 0 |
| 0.9541666666666666 | 0 |
| 0.9548611111111112 | 0 |
| 0.9555555555555556 | 0 |
| 0.9562499999999999 | 0 |
| 0.9569444444444444 | 0 |
| 0.9576388888888889 | 0 |
| 0.9583333333333334 | 0 |
| 0.9590277777777777 | 0 |
| 0.9597222222222223 | 0 |
| 0.9604166666666667 | 0 |
| 0.9611111111111111 | 0 |
| 0.9618055555555555 | 0 |
| 0.9625 | 0 |
| 0.9631944444444445 | 0 |
| 0.9638888888888889 | 0 |
| 0.9645833333333332 | 0 |
| 0.9652777777777778 | 0 |
| 0.9659722222222222 | 0 |
| 0.9666666666666667 | 0 |
| 0.967361111111111 | 0 |
| 0.9680555555555556 | 0 |
| 0.96875 | 0 |
| 0.9694444444444444 | 0 |
| 0.970138888888889 | 0 |
| 0.9708333333333333 | 0 |
| 0.9715277777777778 | 0 |
| 0.9722222222222222 | 0 |
| 0.9729166666666668 | 0 |
| 0.9736111111111111 | 0 |
| 0.9743055555555555 | 0 |
| 0.975 | 0 |
| 0.9756944444444445 | 0 |
| 0.9763888888888889 | 0 |
| 0.9770833333333333 | 0 |
| 0.9777777777777777 | 0 |
| 0.9784722222222223 | 0 |
| 0.9791666666666666 | 0 |
| 0.9798611111111111 | 0 |
| 0.9805555555555556 | 0 |
| 0.9812500000000001 | 0 |
| 0.9819444444444444 | 0 |
| 0.9826388888888888 | 0 |
| 0.9833333333333334 | 0 |
| 0.9840277777777778 | 0 |
| 0.9847222222222222 | 0 |
| 0.9854166666666666 | 0 |
| 0.9861111111111112 | 0 |
| 0.9868055555555556 | 0 |
| 0.9874999999999999 | 0 |
| 0.9881944444444444 | 0 |
| 0.9888888888888889 | 0 |
| 0.9895833333333334 | 0 |
| 0.9902777777777777 | 0 |
| 0.9909722222222223 | 0 |
| 0.9916666666666667 | 0 |
| 0.9923611111111111 | 0 |
| 0.9930555555555555 | 0 |
| 0.99375 | 0 |
| 0.9944444444444445 | 0 |
| 0.9951388888888889 | 0 |
| 0.9958333333333332 | 0 |
| 0.9965277777777778 | 0 |
| 0.9972222222222222 | 0 |
| 0.9979166666666667 | 0 |
| 0.998611111111111 | 0 |
| 0.9993055555555556 | 0 |